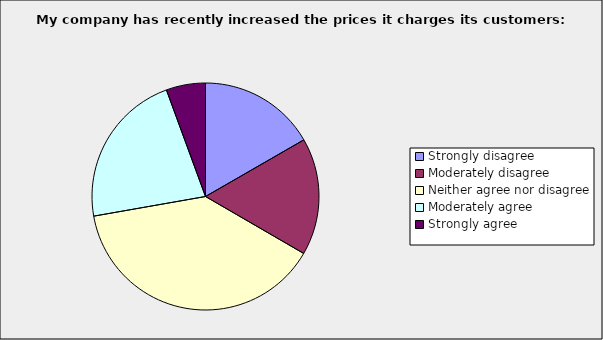
| Category | Series 0 |
|---|---|
| Strongly disagree | 0.167 |
| Moderately disagree | 0.167 |
| Neither agree nor disagree | 0.389 |
| Moderately agree | 0.222 |
| Strongly agree | 0.056 |